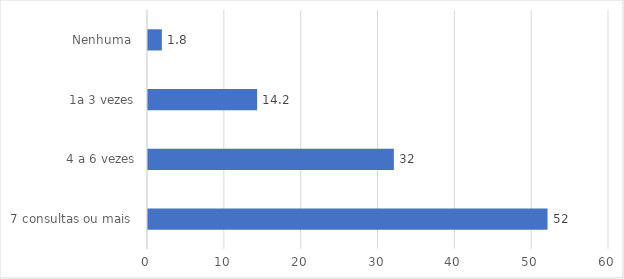
| Category | Series 0 |
|---|---|
| 7 consultas ou mais  | 52 |
| 4 a 6 vezes | 32 |
| 1a 3 vezes | 14.2 |
| Nenhuma  | 1.8 |